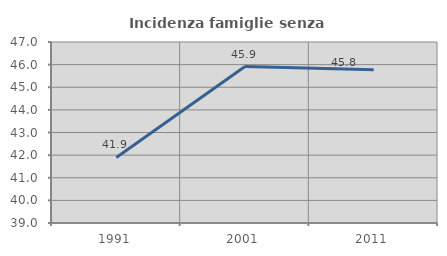
| Category | Incidenza famiglie senza nuclei |
|---|---|
| 1991.0 | 41.897 |
| 2001.0 | 45.914 |
| 2011.0 | 45.775 |